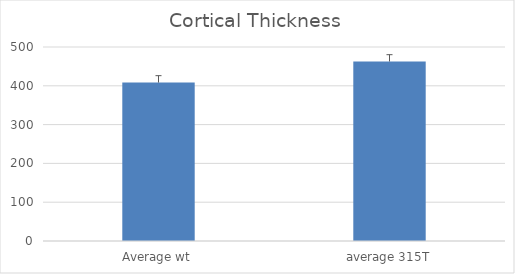
| Category | Series 0 |
|---|---|
| Average wt | 408.38 |
| average 315T | 462.597 |